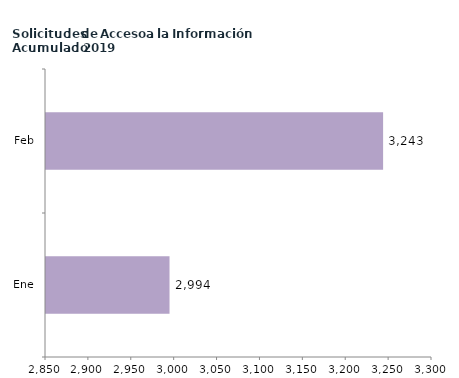
| Category | Series 0 |
|---|---|
| Ene | 2994 |
| Feb | 3243 |